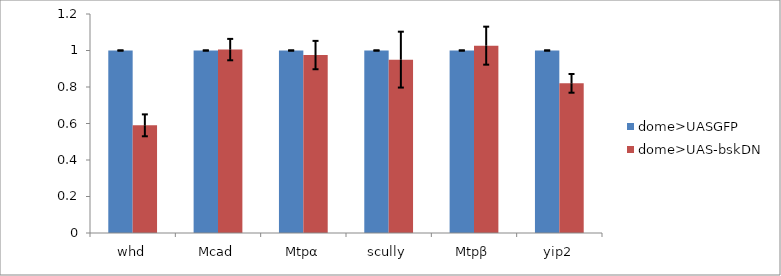
| Category | dome>UASGFP | dome>UAS-bskDN |
|---|---|---|
| whd | 1 | 0.59 |
| Mcad | 1 | 1.005 |
| Mtpα | 1 | 0.975 |
| scully | 1 | 0.95 |
| Mtpβ | 1 | 1.026 |
| yip2 | 1 | 0.82 |